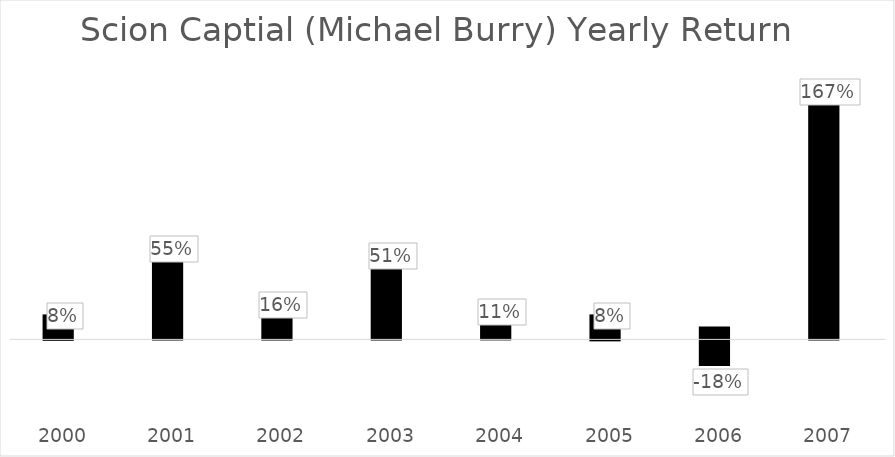
| Category | Scion Captial (Michael Burry) Yearly Return |
|---|---|
| 2000.0 | 0.082 |
| 2001.0 | 0.554 |
| 2002.0 | 0.161 |
| 2003.0 | 0.507 |
| 2004.0 | 0.108 |
| 2005.0 | 0.078 |
| 2006.0 | -0.182 |
| 2007.0 | 1.669 |